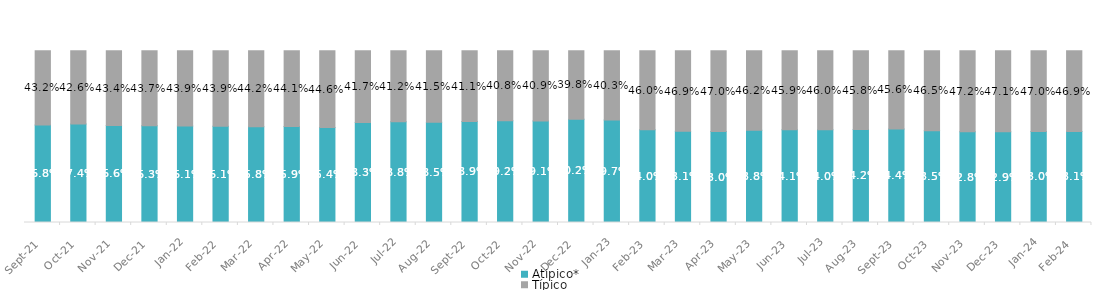
| Category | Atípico* | Típico |
|---|---|---|
| 2021-09-01 | 0.568 | 0.432 |
| 2021-10-01 | 0.574 | 0.426 |
| 2021-11-01 | 0.566 | 0.434 |
| 2021-12-01 | 0.563 | 0.437 |
| 2022-01-01 | 0.561 | 0.439 |
| 2022-02-01 | 0.561 | 0.439 |
| 2022-03-01 | 0.558 | 0.442 |
| 2022-04-01 | 0.559 | 0.441 |
| 2022-05-01 | 0.554 | 0.446 |
| 2022-06-01 | 0.583 | 0.417 |
| 2022-07-31 | 0.588 | 0.412 |
| 2022-08-31 | 0.585 | 0.415 |
| 2022-09-01 | 0.589 | 0.411 |
| 2022-10-01 | 0.592 | 0.408 |
| 2022-11-01 | 0.591 | 0.409 |
| 2022-12-01 | 0.602 | 0.398 |
| 2023-01-01 | 0.597 | 0.403 |
| 2023-02-01 | 0.54 | 0.46 |
| 2023-03-01 | 0.531 | 0.469 |
| 2023-04-01 | 0.53 | 0.47 |
| 2023-05-01 | 0.538 | 0.462 |
| 2023-06-01 | 0.541 | 0.459 |
| 2023-07-01 | 0.54 | 0.46 |
| 2023-08-01 | 0.542 | 0.458 |
| 2023-09-01 | 0.544 | 0.456 |
| 2023-10-01 | 0.535 | 0.465 |
| 2023-11-01 | 0.528 | 0.472 |
| 2023-12-01 | 0.529 | 0.471 |
| 2024-01-01 | 0.53 | 0.47 |
| 2024-02-01 | 0.531 | 0.469 |